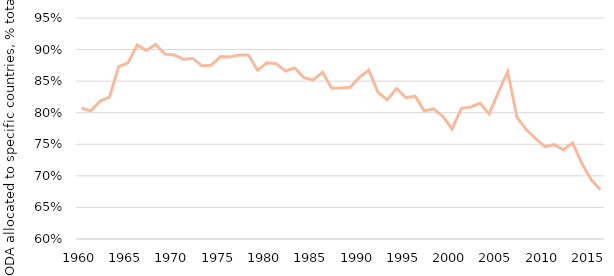
| Category | ODA allocated to a specific country |
|---|---|
| 1960.0 | 0.807 |
| 1961.0 | 0.803 |
| 1962.0 | 0.818 |
| 1963.0 | 0.825 |
| 1964.0 | 0.873 |
| 1965.0 | 0.879 |
| 1966.0 | 0.907 |
| 1967.0 | 0.899 |
| 1968.0 | 0.908 |
| 1969.0 | 0.893 |
| 1970.0 | 0.891 |
| 1971.0 | 0.885 |
| 1972.0 | 0.886 |
| 1973.0 | 0.874 |
| 1974.0 | 0.875 |
| 1975.0 | 0.889 |
| 1976.0 | 0.888 |
| 1977.0 | 0.891 |
| 1978.0 | 0.891 |
| 1979.0 | 0.867 |
| 1980.0 | 0.879 |
| 1981.0 | 0.878 |
| 1982.0 | 0.866 |
| 1983.0 | 0.871 |
| 1984.0 | 0.855 |
| 1985.0 | 0.852 |
| 1986.0 | 0.864 |
| 1987.0 | 0.839 |
| 1988.0 | 0.839 |
| 1989.0 | 0.84 |
| 1990.0 | 0.856 |
| 1991.0 | 0.867 |
| 1992.0 | 0.832 |
| 1993.0 | 0.82 |
| 1994.0 | 0.839 |
| 1995.0 | 0.824 |
| 1996.0 | 0.826 |
| 1997.0 | 0.803 |
| 1998.0 | 0.806 |
| 1999.0 | 0.794 |
| 2000.0 | 0.774 |
| 2001.0 | 0.807 |
| 2002.0 | 0.809 |
| 2003.0 | 0.815 |
| 2004.0 | 0.798 |
| 2005.0 | 0.833 |
| 2006.0 | 0.865 |
| 2007.0 | 0.792 |
| 2008.0 | 0.773 |
| 2009.0 | 0.759 |
| 2010.0 | 0.746 |
| 2011.0 | 0.749 |
| 2012.0 | 0.742 |
| 2013.0 | 0.752 |
| 2014.0 | 0.72 |
| 2015.0 | 0.694 |
| 2016.0 | 0.678 |